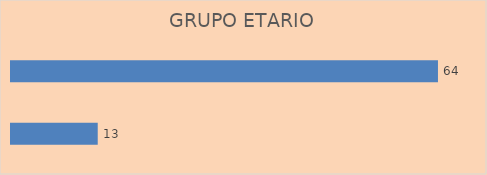
| Category | Total |
|---|---|
| 27 - 59 años | 13 |
| 60 años o más | 64 |